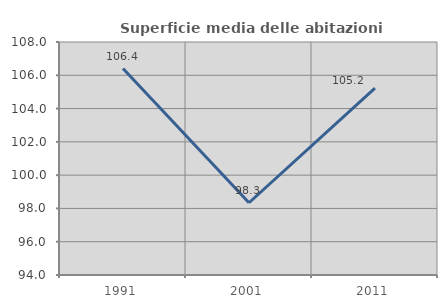
| Category | Superficie media delle abitazioni occupate |
|---|---|
| 1991.0 | 106.407 |
| 2001.0 | 98.342 |
| 2011.0 | 105.224 |